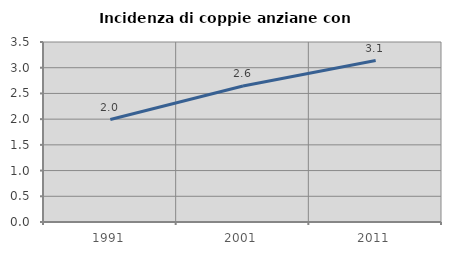
| Category | Incidenza di coppie anziane con figli |
|---|---|
| 1991.0 | 1.992 |
| 2001.0 | 2.643 |
| 2011.0 | 3.139 |